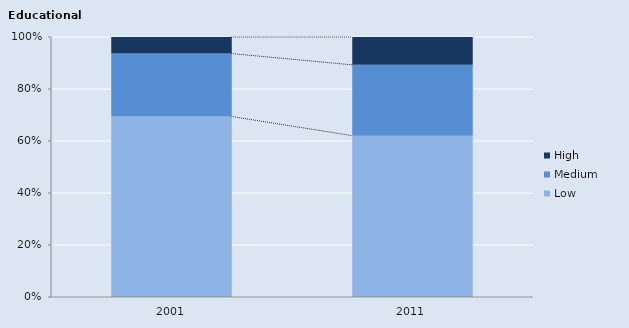
| Category | Low | Medium     | High |
|---|---|---|---|
| 2001.0 | 847.125 | 295.086 | 77.876 |
| 2011.0 | 875.799 | 384.411 | 151.224 |